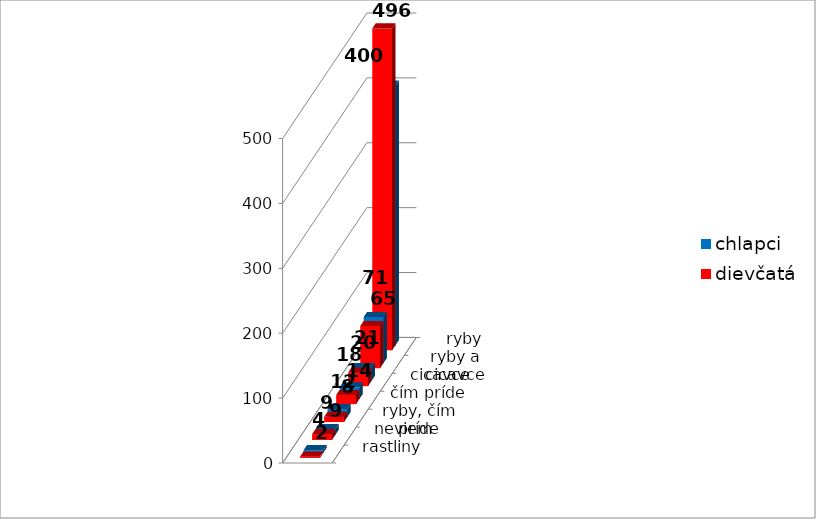
| Category | chlapci | dievčatá |
|---|---|---|
| ryby | 400 | 496 |
| ryby a cicavce | 71 | 65 |
| cicavce | 20 | 21 |
| čím príde | 18 | 14 |
| ryby, čím príde | 12 | 8 |
| neviem | 9 | 9 |
| rastliny | 4 | 2 |